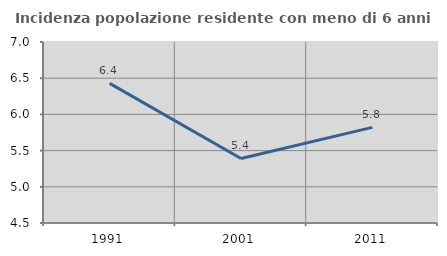
| Category | Incidenza popolazione residente con meno di 6 anni |
|---|---|
| 1991.0 | 6.429 |
| 2001.0 | 5.392 |
| 2011.0 | 5.821 |